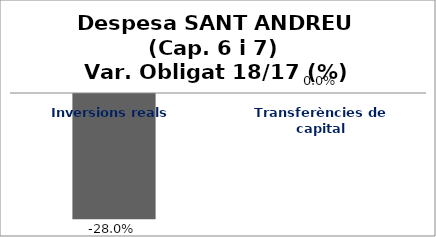
| Category | Series 0 |
|---|---|
| Inversions reals | -0.28 |
| Transferències de capital | 0 |